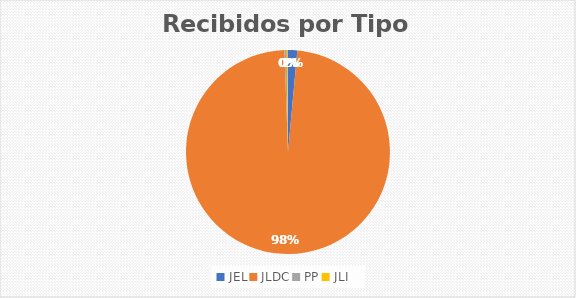
| Category | Series 0 |
|---|---|
| JEL | 8 |
| JLDC | 535 |
| PP | 2 |
| JLI | 1 |